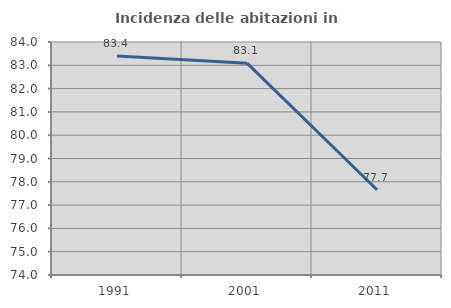
| Category | Incidenza delle abitazioni in proprietà  |
|---|---|
| 1991.0 | 83.396 |
| 2001.0 | 83.092 |
| 2011.0 | 77.658 |